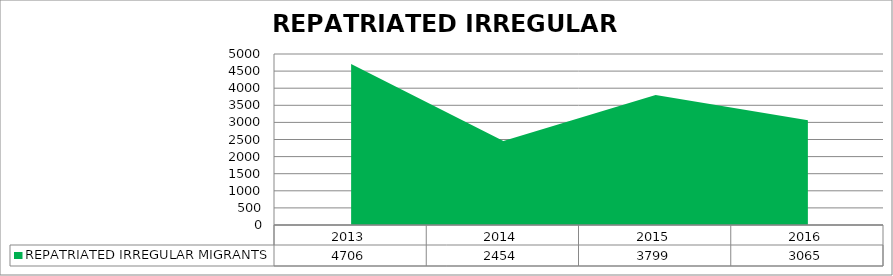
| Category | REPATRIATED IRREGULAR MIGRANTS |
|---|---|
| 2013.0 | 4706 |
| 2014.0 | 2454 |
| 2015.0 | 3799 |
| 2016.0 | 3065 |